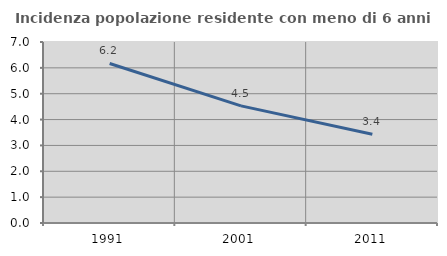
| Category | Incidenza popolazione residente con meno di 6 anni |
|---|---|
| 1991.0 | 6.169 |
| 2001.0 | 4.529 |
| 2011.0 | 3.435 |